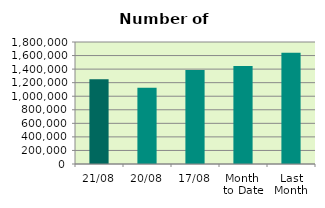
| Category | Series 0 |
|---|---|
| 21/08 | 1249684 |
| 20/08 | 1126012 |
| 17/08 | 1385416 |
| Month 
to Date | 1445771.6 |
| Last
Month | 1640369.455 |